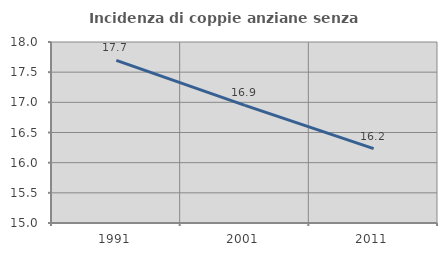
| Category | Incidenza di coppie anziane senza figli  |
|---|---|
| 1991.0 | 17.697 |
| 2001.0 | 16.949 |
| 2011.0 | 16.232 |